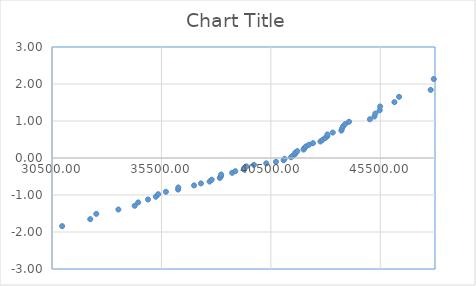
| Category | Series 0 |
|---|---|
| 30024.0 | -2.135 |
| 30962.0 | -1.841 |
| 32247.0 | -1.653 |
| 32523.0 | -1.51 |
| 33534.0 | -1.392 |
| 34277.0 | -1.291 |
| 34439.0 | -1.202 |
| 34888.0 | -1.121 |
| 35245.0 | -1.047 |
| 35351.0 | -0.978 |
| 35705.0 | -0.914 |
| 36262.0 | -0.853 |
| 36271.0 | -0.796 |
| 36991.0 | -0.74 |
| 37305.0 | -0.687 |
| 37700.0 | -0.636 |
| 37795.0 | -0.587 |
| 38168.0 | -0.539 |
| 38219.0 | -0.492 |
| 38230.0 | -0.446 |
| 38730.0 | -0.401 |
| 38875.0 | -0.357 |
| 39278.0 | -0.313 |
| 39284.0 | -0.27 |
| 39386.0 | -0.228 |
| 39726.0 | -0.186 |
| 40291.0 | -0.144 |
| 40734.0 | -0.103 |
| 41083.0 | -0.062 |
| 41126.0 | -0.021 |
| 41419.0 | 0.021 |
| 41502.0 | 0.062 |
| 41600.0 | 0.103 |
| 41616.0 | 0.144 |
| 41706.0 | 0.186 |
| 41995.0 | 0.228 |
| 42033.0 | 0.27 |
| 42103.0 | 0.313 |
| 42242.0 | 0.357 |
| 42424.0 | 0.401 |
| 42766.0 | 0.446 |
| 42857.0 | 0.492 |
| 42979.0 | 0.539 |
| 43077.0 | 0.587 |
| 43086.0 | 0.636 |
| 43330.0 | 0.687 |
| 43723.0 | 0.74 |
| 43751.0 | 0.796 |
| 43799.0 | 0.853 |
| 43889.0 | 0.914 |
| 44071.0 | 0.978 |
| 45024.0 | 1.047 |
| 45233.0 | 1.121 |
| 45274.0 | 1.202 |
| 45474.0 | 1.291 |
| 45493.0 | 1.392 |
| 46146.0 | 1.51 |
| 46357.0 | 1.653 |
| 47803.0 | 1.841 |
| 47944.0 | 2.135 |